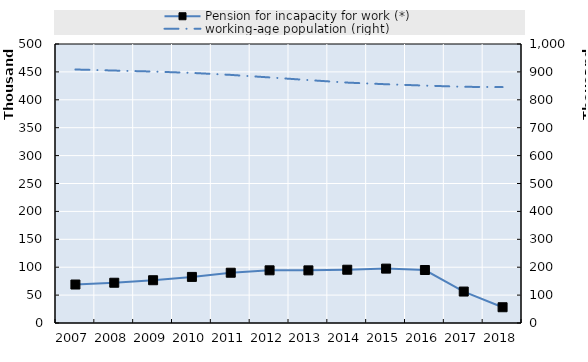
| Category | Pension for incapacity for work (*) | 0 | Series 14 | Series 15 | Series 16 | Series 17 | Series 18 |
|---|---|---|---|---|---|---|---|
| 2007.0 | 68947 |  |  |  |  |  |  |
| 2008.0 | 72158.5 |  |  |  |  |  |  |
| 2009.0 | 76662 |  |  |  |  |  |  |
| 2010.0 | 82590 |  |  |  |  |  |  |
| 2011.0 | 90093 |  |  |  |  |  |  |
| 2012.0 | 94418 |  |  |  |  |  |  |
| 2013.0 | 94325 |  |  |  |  |  |  |
| 2014.0 | 95480 |  |  |  |  |  |  |
| 2015.0 | 97459 |  |  |  |  |  |  |
| 2016.0 | 94971 |  |  |  |  |  |  |
| 2017.0 | 56349 |  |  |  |  |  |  |
| 2018.0 | 28253 |  |  |  |  |  |  |